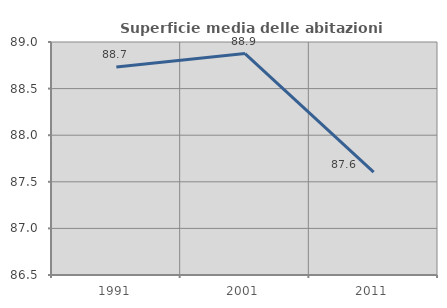
| Category | Superficie media delle abitazioni occupate |
|---|---|
| 1991.0 | 88.731 |
| 2001.0 | 88.875 |
| 2011.0 | 87.603 |